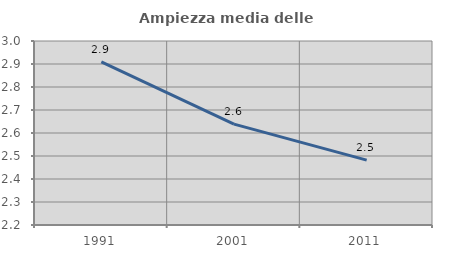
| Category | Ampiezza media delle famiglie |
|---|---|
| 1991.0 | 2.91 |
| 2001.0 | 2.638 |
| 2011.0 | 2.482 |